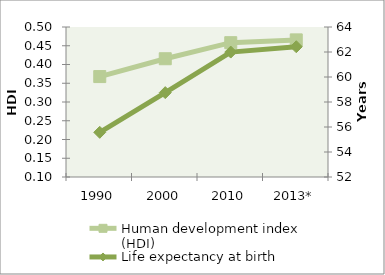
| Category | Human development index (HDI) |
|---|---|
| 1990 | 0.368 |
| 2000 | 0.415 |
| 2010 | 0.458 |
| 2013* | 0.466 |